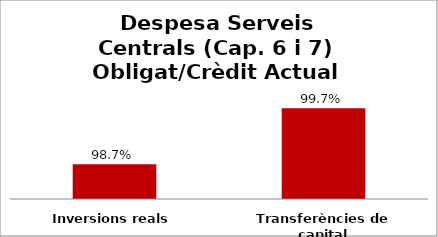
| Category | Series 0 |
|---|---|
| Inversions reals | 0.987 |
| Transferències de capital | 0.997 |